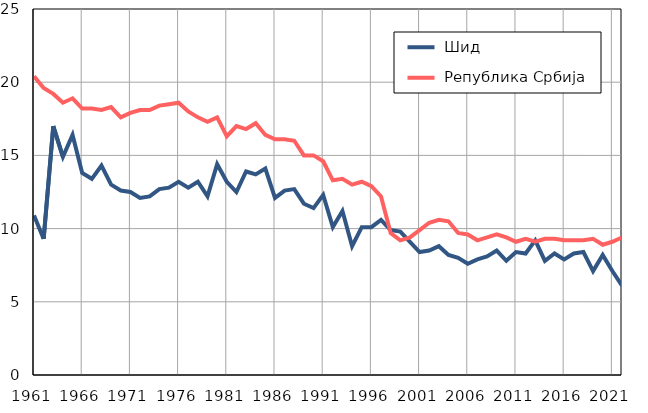
| Category |  Шид |  Република Србија |
|---|---|---|
| 1961.0 | 10.9 | 20.4 |
| 1962.0 | 9.3 | 19.6 |
| 1963.0 | 17 | 19.2 |
| 1964.0 | 14.9 | 18.6 |
| 1965.0 | 16.4 | 18.9 |
| 1966.0 | 13.8 | 18.2 |
| 1967.0 | 13.4 | 18.2 |
| 1968.0 | 14.3 | 18.1 |
| 1969.0 | 13 | 18.3 |
| 1970.0 | 12.6 | 17.6 |
| 1971.0 | 12.5 | 17.9 |
| 1972.0 | 12.1 | 18.1 |
| 1973.0 | 12.2 | 18.1 |
| 1974.0 | 12.7 | 18.4 |
| 1975.0 | 12.8 | 18.5 |
| 1976.0 | 13.2 | 18.6 |
| 1977.0 | 12.8 | 18 |
| 1978.0 | 13.2 | 17.6 |
| 1979.0 | 12.2 | 17.3 |
| 1980.0 | 14.4 | 17.6 |
| 1981.0 | 13.2 | 16.3 |
| 1982.0 | 12.5 | 17 |
| 1983.0 | 13.9 | 16.8 |
| 1984.0 | 13.7 | 17.2 |
| 1985.0 | 14.1 | 16.4 |
| 1986.0 | 12.1 | 16.1 |
| 1987.0 | 12.6 | 16.1 |
| 1988.0 | 12.7 | 16 |
| 1989.0 | 11.7 | 15 |
| 1990.0 | 11.4 | 15 |
| 1991.0 | 12.3 | 14.6 |
| 1992.0 | 10.1 | 13.3 |
| 1993.0 | 11.2 | 13.4 |
| 1994.0 | 8.8 | 13 |
| 1995.0 | 10.1 | 13.2 |
| 1996.0 | 10.1 | 12.9 |
| 1997.0 | 10.6 | 12.2 |
| 1998.0 | 9.9 | 9.7 |
| 1999.0 | 9.8 | 9.2 |
| 2000.0 | 9.1 | 9.4 |
| 2001.0 | 8.4 | 9.9 |
| 2002.0 | 8.5 | 10.4 |
| 2003.0 | 8.8 | 10.6 |
| 2004.0 | 8.2 | 10.5 |
| 2005.0 | 8 | 9.7 |
| 2006.0 | 7.6 | 9.6 |
| 2007.0 | 7.9 | 9.2 |
| 2008.0 | 8.1 | 9.4 |
| 2009.0 | 8.5 | 9.6 |
| 2010.0 | 7.8 | 9.4 |
| 2011.0 | 8.4 | 9.1 |
| 2012.0 | 8.3 | 9.3 |
| 2013.0 | 9.2 | 9.1 |
| 2014.0 | 7.8 | 9.3 |
| 2015.0 | 8.3 | 9.3 |
| 2016.0 | 7.9 | 9.2 |
| 2017.0 | 8.3 | 9.2 |
| 2018.0 | 8.4 | 9.2 |
| 2019.0 | 7.1 | 9.3 |
| 2020.0 | 8.2 | 8.9 |
| 2021.0 | 7.1 | 9.1 |
| 2022.0 | 6.1 | 9.4 |